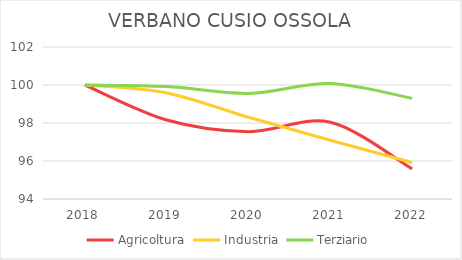
| Category | Agricoltura | Industria | Terziario |
|---|---|---|---|
| 2018.0 | 100 | 100 | 100 |
| 2019.0 | 98.16 | 99.581 | 99.92 |
| 2020.0 | 97.546 | 98.3 | 99.558 |
| 2021.0 | 98.037 | 97.089 | 100.08 |
| 2022.0 | 95.583 | 95.925 | 99.296 |